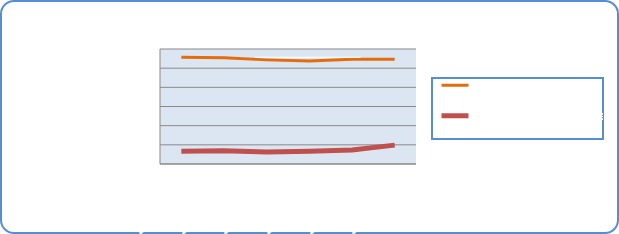
| Category | Motorin Türleri | Benzin Türleri |
|---|---|---|
| 3/2/20 | 55655754.995 | 6612746.533 |
| 3/3/20 | 55408580.447 | 6897111.588 |
| 3/4/20 | 54325580.421 | 6322234.738 |
| 3/5/20 | 53686133.658 | 6627297.417 |
| 3/6/20 | 54707899.524 | 7272287.012 |
| 3/7/20 | 54606812.397 | 9845518.693 |